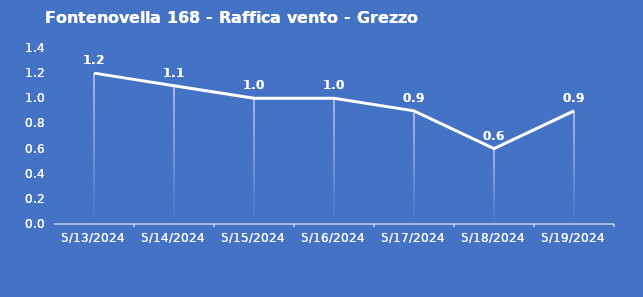
| Category | Fontenovella 168 - Raffica vento - Grezzo (m/s) |
|---|---|
| 5/13/24 | 1.2 |
| 5/14/24 | 1.1 |
| 5/15/24 | 1 |
| 5/16/24 | 1 |
| 5/17/24 | 0.9 |
| 5/18/24 | 0.6 |
| 5/19/24 | 0.9 |